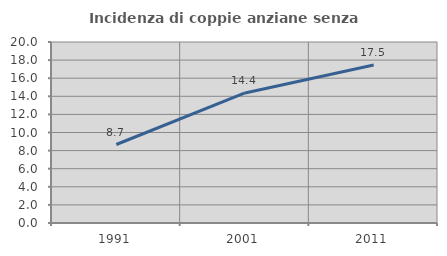
| Category | Incidenza di coppie anziane senza figli  |
|---|---|
| 1991.0 | 8.673 |
| 2001.0 | 14.372 |
| 2011.0 | 17.458 |